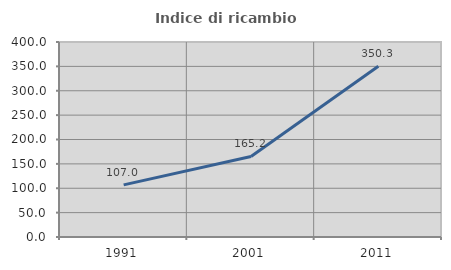
| Category | Indice di ricambio occupazionale  |
|---|---|
| 1991.0 | 106.977 |
| 2001.0 | 165.203 |
| 2011.0 | 350.267 |